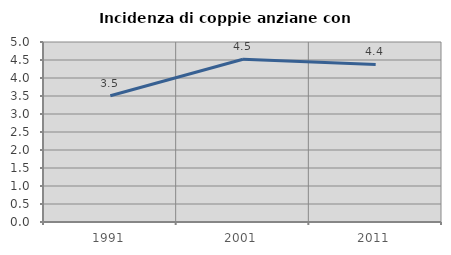
| Category | Incidenza di coppie anziane con figli |
|---|---|
| 1991.0 | 3.506 |
| 2001.0 | 4.523 |
| 2011.0 | 4.378 |